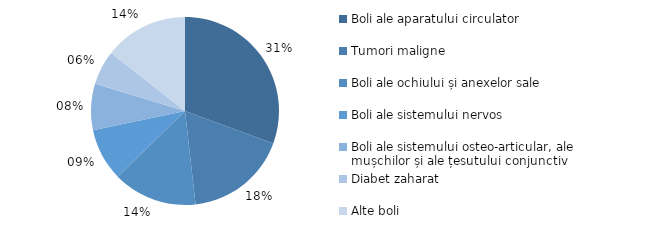
| Category | Series 0 |
|---|---|
| Boli ale aparatului circulator | 30.6 |
| Tumori maligne | 17.6 |
| Boli ale ochiului și anexelor sale | 14.5 |
| Boli ale sistemului nervos | 9 |
| Boli ale sistemului osteo-articular, ale mușchilor și ale țesutului conjunctiv | 8 |
| Diabet zaharat | 5.9 |
| Alte boli | 14.4 |